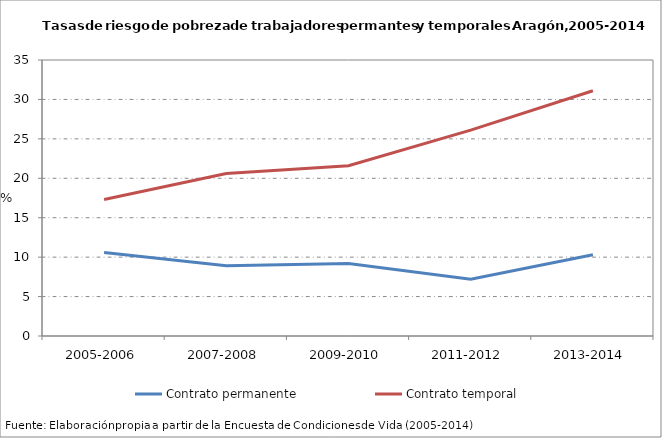
| Category | Contrato permanente | Contrato temporal |
|---|---|---|
| 2005-2006 | 10.6 | 17.3 |
| 2007-2008 | 8.9 | 20.6 |
| 2009-2010 | 9.2 | 21.6 |
| 2011-2012 | 7.2 | 26.1 |
| 2013-2014 | 10.3 | 31.1 |